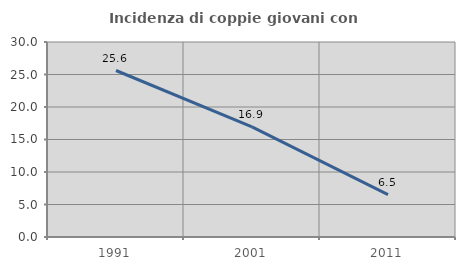
| Category | Incidenza di coppie giovani con figli |
|---|---|
| 1991.0 | 25.614 |
| 2001.0 | 16.949 |
| 2011.0 | 6.507 |